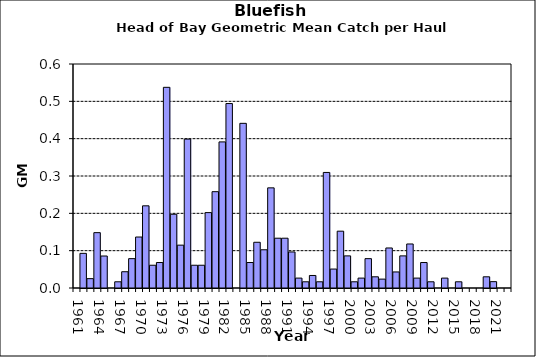
| Category | Series 0 |
|---|---|
| 1961.0 | 0 |
| 1962.0 | 0.093 |
| 1963.0 | 0.025 |
| 1964.0 | 0.148 |
| 1965.0 | 0.086 |
| 1966.0 | 0 |
| 1967.0 | 0.017 |
| 1968.0 | 0.044 |
| 1969.0 | 0.079 |
| 1970.0 | 0.137 |
| 1971.0 | 0.22 |
| 1972.0 | 0.061 |
| 1973.0 | 0.068 |
| 1974.0 | 0.538 |
| 1975.0 | 0.198 |
| 1976.0 | 0.115 |
| 1977.0 | 0.399 |
| 1978.0 | 0.061 |
| 1979.0 | 0.061 |
| 1980.0 | 0.202 |
| 1981.0 | 0.258 |
| 1982.0 | 0.391 |
| 1983.0 | 0.494 |
| 1984.0 | 0 |
| 1985.0 | 0.441 |
| 1986.0 | 0.068 |
| 1987.0 | 0.122 |
| 1988.0 | 0.102 |
| 1989.0 | 0.268 |
| 1990.0 | 0.133 |
| 1991.0 | 0.133 |
| 1992.0 | 0.097 |
| 1993.0 | 0.027 |
| 1994.0 | 0.017 |
| 1995.0 | 0.034 |
| 1996.0 | 0.017 |
| 1997.0 | 0.31 |
| 1998.0 | 0.051 |
| 1999.0 | 0.152 |
| 2000.0 | 0.086 |
| 2001.0 | 0.017 |
| 2002.0 | 0.027 |
| 2003.0 | 0.079 |
| 2004.0 | 0.03 |
| 2005.0 | 0.024 |
| 2006.0 | 0.107 |
| 2007.0 | 0.043 |
| 2008.0 | 0.086 |
| 2009.0 | 0.118 |
| 2010.0 | 0.027 |
| 2011.0 | 0.068 |
| 2012.0 | 0.017 |
| 2013.0 | 0 |
| 2014.0 | 0.027 |
| 2015.0 | 0 |
| 2016.0 | 0.017 |
| 2017.0 | 0 |
| 2018.0 | 0 |
| 2019.0 | 0 |
| 2020.0 | 0.03 |
| 2021.0 | 0.017 |
| 2022.0 | 0 |
| 2023.0 | 0 |